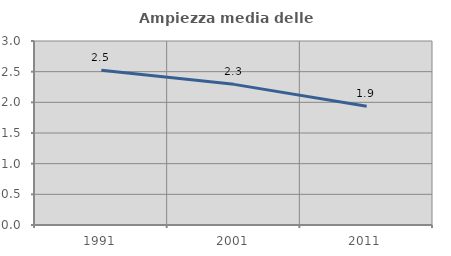
| Category | Ampiezza media delle famiglie |
|---|---|
| 1991.0 | 2.523 |
| 2001.0 | 2.293 |
| 2011.0 | 1.937 |